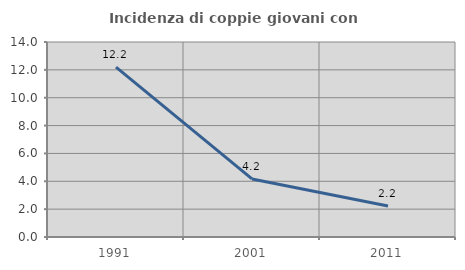
| Category | Incidenza di coppie giovani con figli |
|---|---|
| 1991.0 | 12.195 |
| 2001.0 | 4.167 |
| 2011.0 | 2.222 |